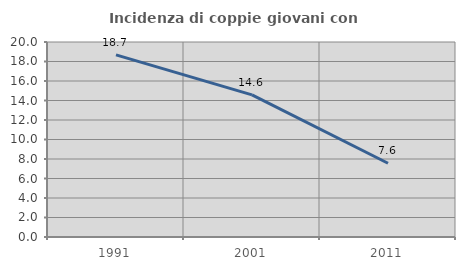
| Category | Incidenza di coppie giovani con figli |
|---|---|
| 1991.0 | 18.683 |
| 2001.0 | 14.58 |
| 2011.0 | 7.563 |